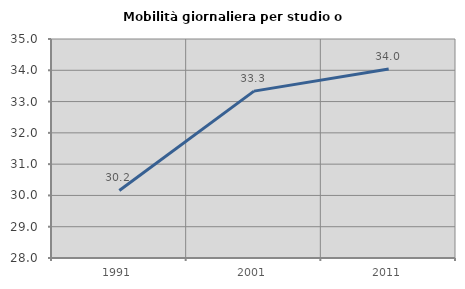
| Category | Mobilità giornaliera per studio o lavoro |
|---|---|
| 1991.0 | 30.159 |
| 2001.0 | 33.333 |
| 2011.0 | 34.043 |